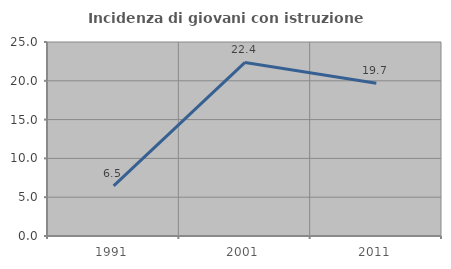
| Category | Incidenza di giovani con istruzione universitaria |
|---|---|
| 1991.0 | 6.452 |
| 2001.0 | 22.368 |
| 2011.0 | 19.697 |